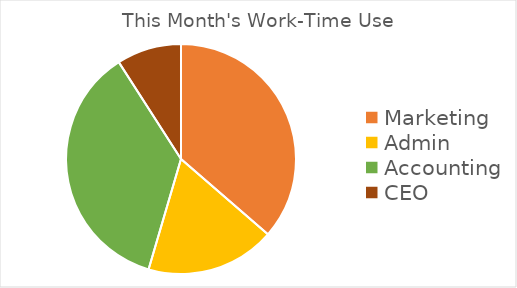
| Category | Series 0 |
|---|---|
| 0 | 36.364 |
| 1 | 18.182 |
| 2 | 36.364 |
| 3 | 9.091 |